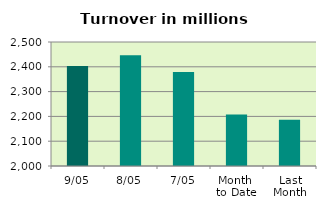
| Category | Series 0 |
|---|---|
| 9/05 | 2403.105 |
| 8/05 | 2446.843 |
| 7/05 | 2378.996 |
| Month 
to Date | 2207.908 |
| Last
Month | 2186.926 |